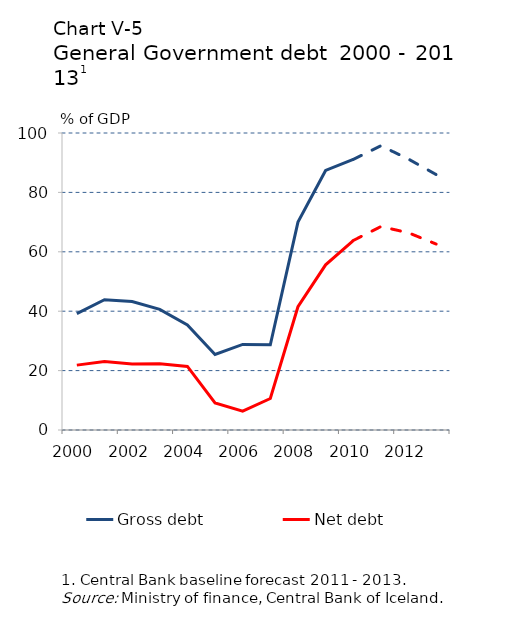
| Category | Gross debt |
|---|---|
| 2000.0 | 39.211 |
| 2001.0 | 43.879 |
| 2002.0 | 43.252 |
| 2003.0 | 40.629 |
| 2004.0 | 35.399 |
| 2005.0 | 25.414 |
| 2006.0 | 28.803 |
| 2007.0 | 28.7 |
| 2008.0 | 70 |
| 2009.0 | 87.4 |
| 2010.0 | 91.1 |
| 2011.0 | 95.7 |
| 2012.0 | 91.2 |
| 2013.0 | 86 |